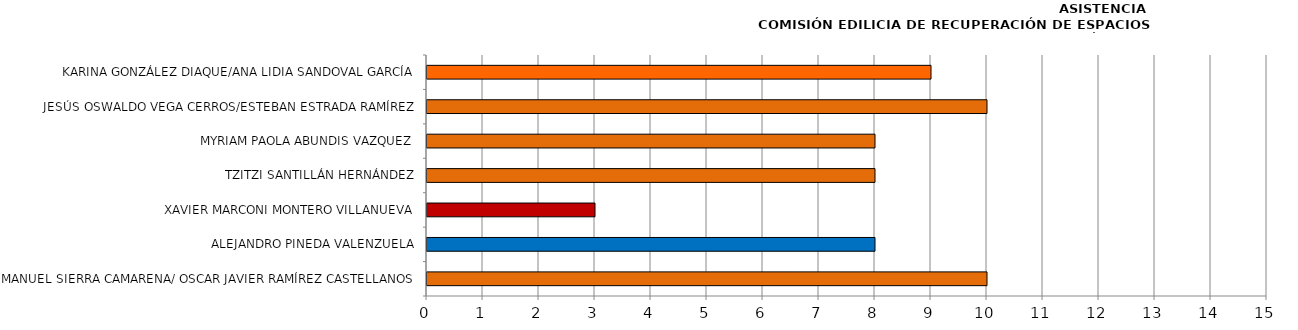
| Category | Series 0 |
|---|---|
| MANUEL SIERRA CAMARENA/ OSCAR JAVIER RAMÍREZ CASTELLANOS | 10 |
| ALEJANDRO PINEDA VALENZUELA | 8 |
| XAVIER MARCONI MONTERO VILLANUEVA | 3 |
| TZITZI SANTILLÁN HERNÁNDEZ | 8 |
| MYRIAM PAOLA ABUNDIS VAZQUEZ | 8 |
| JESÚS OSWALDO VEGA CERROS/ESTEBAN ESTRADA RAMÍREZ | 10 |
| KARINA GONZÁLEZ DIAQUE/ANA LIDIA SANDOVAL GARCÍA | 9 |